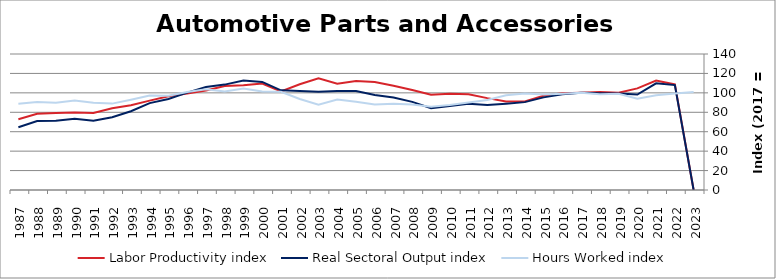
| Category | Labor Productivity index | Real Sectoral Output index | Hours Worked index |
|---|---|---|---|
| 2023.0 | 0 | 0 | 100.77 |
| 2022.0 | 108.679 | 107.988 | 99.364 |
| 2021.0 | 112.67 | 109.813 | 97.464 |
| 2020.0 | 104.624 | 98.212 | 93.871 |
| 2019.0 | 100.239 | 99.317 | 99.08 |
| 2018.0 | 100.865 | 99.539 | 98.686 |
| 2017.0 | 100 | 100 | 100 |
| 2016.0 | 99.547 | 98.544 | 98.993 |
| 2015.0 | 97.019 | 95.368 | 98.298 |
| 2014.0 | 91.047 | 90.456 | 99.35 |
| 2013.0 | 91.18 | 88.893 | 97.491 |
| 2012.0 | 94.582 | 87.61 | 92.629 |
| 2011.0 | 98.626 | 88.884 | 90.122 |
| 2010.0 | 98.953 | 86.588 | 87.504 |
| 2009.0 | 98.142 | 84.197 | 85.791 |
| 2008.0 | 102.962 | 90.705 | 88.095 |
| 2007.0 | 107.335 | 95.282 | 88.771 |
| 2006.0 | 111.146 | 97.719 | 87.919 |
| 2005.0 | 112.198 | 101.92 | 90.839 |
| 2004.0 | 109.306 | 101.904 | 93.228 |
| 2003.0 | 115.047 | 101.076 | 87.856 |
| 2002.0 | 108.844 | 101.918 | 93.637 |
| 2001.0 | 101.453 | 102.64 | 101.17 |
| 2000.0 | 109.631 | 111.288 | 101.512 |
| 1999.0 | 107.818 | 112.59 | 104.425 |
| 1998.0 | 107.107 | 108.494 | 101.295 |
| 1997.0 | 102.352 | 106.078 | 103.641 |
| 1996.0 | 99.255 | 100.231 | 100.983 |
| 1995.0 | 96.559 | 93.743 | 97.084 |
| 1994.0 | 92.007 | 89.422 | 97.19 |
| 1993.0 | 87.246 | 81.084 | 92.938 |
| 1992.0 | 84.169 | 74.847 | 88.924 |
| 1991.0 | 79.23 | 71.181 | 89.841 |
| 1990.0 | 79.728 | 73.379 | 92.036 |
| 1989.0 | 79.226 | 71.219 | 89.892 |
| 1988.0 | 78.413 | 71.006 | 90.554 |
| 1987.0 | 72.787 | 64.629 | 88.792 |